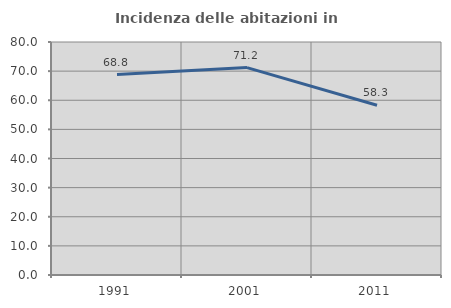
| Category | Incidenza delle abitazioni in proprietà  |
|---|---|
| 1991.0 | 68.8 |
| 2001.0 | 71.21 |
| 2011.0 | 58.296 |